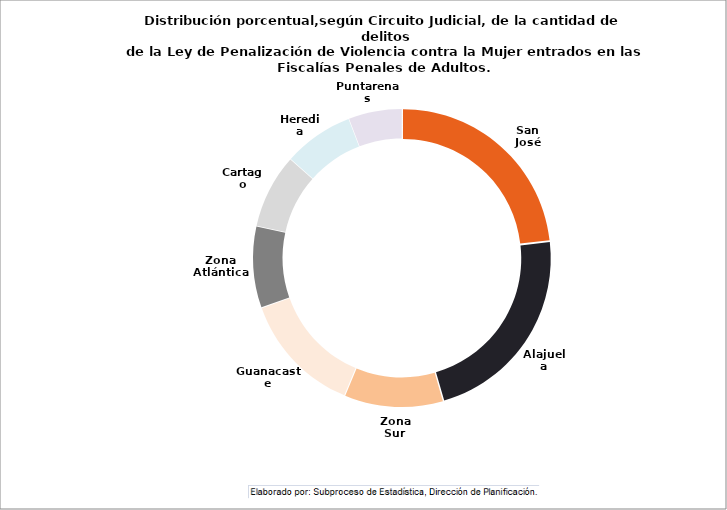
| Category | Entrada Neta |
|---|---|
| San José | 5203 |
| Alajuela | 5008 |
| Zona Sur | 2413 |
| Guanacaste | 2988 |
| Zona Atlántica | 1983 |
| Cartago | 1819 |
| Heredia | 1715 |
| Puntarenas | 1303 |